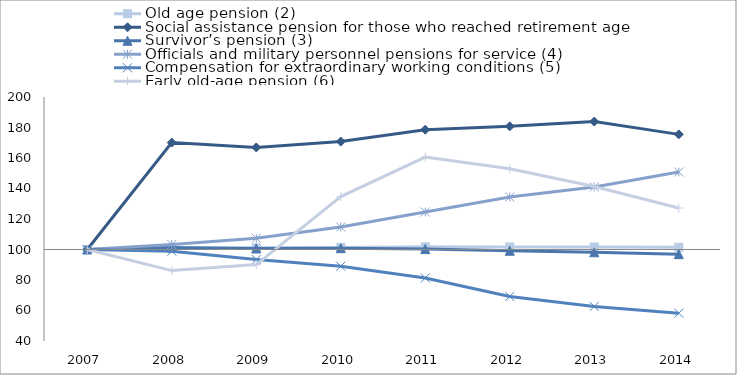
| Category | Old age pension (2) | Social assistance pension for those who reached retirement age | Survivor’s pension (3) | Officials and military personnel pensions for service (4) | Compensation for extraordinary working conditions (5) | Early old-age pension (6) | 0 |
|---|---|---|---|---|---|---|---|
| 2007.0 | 100 | 100 | 100 | 100 | 100 | 100 |  |
| 2008.0 | 100.698 | 170.111 | 101.262 | 103.279 | 98.912 | 86.162 |  |
| 2009.0 | 101.081 | 166.924 | 100.677 | 107.377 | 93.427 | 90.094 |  |
| 2010.0 | 101.368 | 170.785 | 100.861 | 114.754 | 89.031 | 134.652 |  |
| 2011.0 | 101.808 | 178.548 | 100.28 | 124.59 | 81.337 | 160.606 |  |
| 2012.0 | 101.707 | 180.767 | 99.198 | 134.426 | 69.246 | 152.897 |  |
| 2013.0 | 101.622 | 183.911 | 98.173 | 140.984 | 62.651 | 141.334 |  |
| 2014.0 | 101.47 | 175.488 | 96.959 | 150.82 | 58.255 | 127.2 |  |